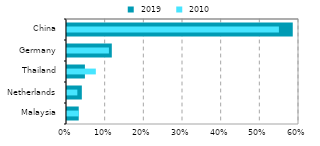
| Category |  2019 |
|---|---|
| Malaysia | 0.03 |
| Netherlands | 0.038 |
| Thailand | 0.046 |
| Germany | 0.116 |
| China | 0.584 |